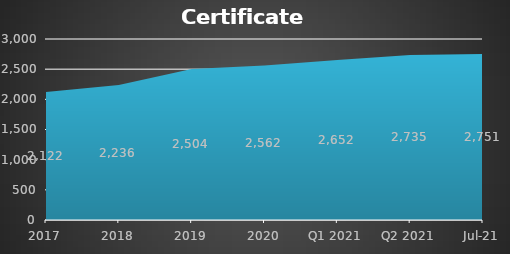
| Category | Certificate holders |
|---|---|
| 2017 | 2122 |
| 2018 | 2236 |
| 2019 | 2504 |
| 2020 | 2562 |
| Q1 2021 | 2652 |
| Q2 2021 | 2735 |
| Jul-21 | 2751 |